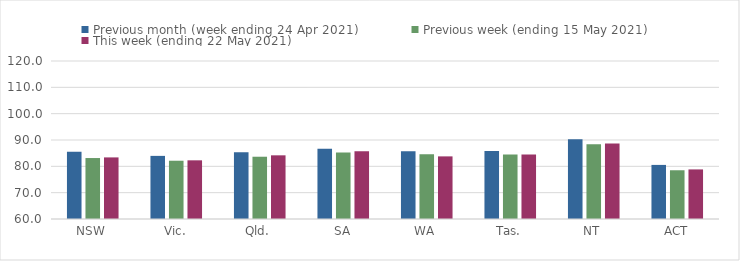
| Category | Previous month (week ending 24 Apr 2021) | Previous week (ending 15 May 2021) | This week (ending 22 May 2021) |
|---|---|---|---|
| NSW | 85.54 | 83.15 | 83.39 |
| Vic. | 83.97 | 82.13 | 82.28 |
| Qld. | 85.39 | 83.65 | 84.18 |
| SA | 86.71 | 85.27 | 85.7 |
| WA | 85.69 | 84.62 | 83.78 |
| Tas. | 85.79 | 84.52 | 84.47 |
| NT | 90.25 | 88.36 | 88.67 |
| ACT | 80.54 | 78.51 | 78.83 |